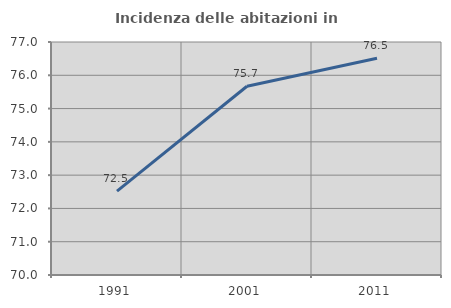
| Category | Incidenza delle abitazioni in proprietà  |
|---|---|
| 1991.0 | 72.52 |
| 2001.0 | 75.672 |
| 2011.0 | 76.511 |